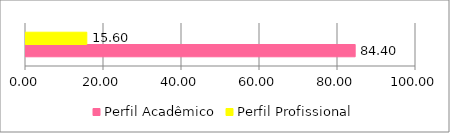
| Category | Perfil Acadêmico | Perfil Profissional |
|---|---|---|
| 0 | 84.404 | 15.596 |